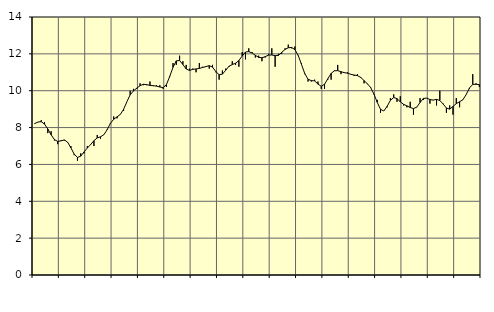
| Category | Piggar | Series 1 |
|---|---|---|
| nan | 8.2 | 8.22 |
| 87.0 | 8.3 | 8.3 |
| 87.0 | 8.4 | 8.32 |
| 87.0 | 8.3 | 8.19 |
| nan | 7.7 | 7.92 |
| 88.0 | 7.8 | 7.61 |
| 88.0 | 7.3 | 7.35 |
| 88.0 | 7.1 | 7.25 |
| nan | 7.3 | 7.28 |
| 89.0 | 7.3 | 7.33 |
| 89.0 | 7.2 | 7.21 |
| 89.0 | 7 | 6.9 |
| nan | 6.5 | 6.56 |
| 90.0 | 6.2 | 6.38 |
| 90.0 | 6.6 | 6.45 |
| 90.0 | 6.6 | 6.68 |
| nan | 7 | 6.89 |
| 91.0 | 7.1 | 7.08 |
| 91.0 | 7 | 7.29 |
| 91.0 | 7.6 | 7.44 |
| nan | 7.4 | 7.5 |
| 92.0 | 7.6 | 7.61 |
| 92.0 | 7.9 | 7.88 |
| 92.0 | 8.2 | 8.23 |
| nan | 8.6 | 8.45 |
| 93.0 | 8.5 | 8.58 |
| 93.0 | 8.7 | 8.71 |
| 93.0 | 8.9 | 8.99 |
| nan | 9.4 | 9.4 |
| 94.0 | 10 | 9.78 |
| 94.0 | 10.1 | 9.99 |
| 94.0 | 10.1 | 10.14 |
| nan | 10.4 | 10.27 |
| 95.0 | 10.3 | 10.35 |
| 95.0 | 10.3 | 10.33 |
| 95.0 | 10.5 | 10.29 |
| nan | 10.3 | 10.27 |
| 96.0 | 10.3 | 10.25 |
| 96.0 | 10.3 | 10.2 |
| 96.0 | 10.1 | 10.17 |
| nan | 10.2 | 10.33 |
| 97.0 | 10.8 | 10.77 |
| 97.0 | 11.5 | 11.27 |
| 97.0 | 11.4 | 11.62 |
| nan | 11.9 | 11.64 |
| 98.0 | 11.6 | 11.42 |
| 98.0 | 11.4 | 11.18 |
| 98.0 | 11.2 | 11.1 |
| nan | 11.2 | 11.16 |
| 99.0 | 11 | 11.18 |
| 99.0 | 11.5 | 11.21 |
| 99.0 | 11.3 | 11.26 |
| nan | 11.3 | 11.31 |
| 0.0 | 11.2 | 11.36 |
| 0.0 | 11.4 | 11.28 |
| 0.0 | 11 | 11.04 |
| nan | 10.6 | 10.87 |
| 1.0 | 11.1 | 10.9 |
| 1.0 | 11.2 | 11.11 |
| 1.0 | 11.3 | 11.33 |
| nan | 11.6 | 11.42 |
| 2.0 | 11.4 | 11.49 |
| 2.0 | 11.3 | 11.64 |
| 2.0 | 12.1 | 11.88 |
| nan | 11.7 | 12.1 |
| 3.0 | 12.3 | 12.12 |
| 3.0 | 12.1 | 12.05 |
| 3.0 | 11.8 | 11.92 |
| nan | 11.9 | 11.81 |
| 4.0 | 11.6 | 11.79 |
| 4.0 | 11.8 | 11.85 |
| 4.0 | 12 | 11.93 |
| nan | 12.3 | 11.94 |
| 5.0 | 11.3 | 11.9 |
| 5.0 | 12 | 11.92 |
| 5.0 | 12 | 12.08 |
| nan | 12.3 | 12.24 |
| 6.0 | 12.5 | 12.33 |
| 6.0 | 12.3 | 12.35 |
| 6.0 | 12.4 | 12.23 |
| nan | 11.9 | 11.92 |
| 7.0 | 11.5 | 11.43 |
| 7.0 | 10.9 | 10.93 |
| 7.0 | 10.5 | 10.62 |
| nan | 10.5 | 10.55 |
| 8.0 | 10.6 | 10.53 |
| 8.0 | 10.5 | 10.36 |
| 8.0 | 10.1 | 10.24 |
| nan | 10.1 | 10.35 |
| 9.0 | 10.6 | 10.65 |
| 9.0 | 10.6 | 10.94 |
| 9.0 | 11.1 | 11.08 |
| nan | 11.4 | 11.09 |
| 10.0 | 10.9 | 11.03 |
| 10.0 | 11 | 10.98 |
| 10.0 | 11 | 10.95 |
| nan | 10.9 | 10.89 |
| 11.0 | 10.8 | 10.85 |
| 11.0 | 10.9 | 10.82 |
| 11.0 | 10.7 | 10.72 |
| nan | 10.4 | 10.55 |
| 12.0 | 10.4 | 10.38 |
| 12.0 | 10.2 | 10.17 |
| 12.0 | 9.8 | 9.82 |
| nan | 9.5 | 9.37 |
| 13.0 | 8.8 | 8.99 |
| 13.0 | 8.9 | 8.9 |
| 13.0 | 9.1 | 9.15 |
| nan | 9.6 | 9.48 |
| 14.0 | 9.8 | 9.63 |
| 14.0 | 9.4 | 9.57 |
| 14.0 | 9.7 | 9.4 |
| nan | 9.2 | 9.26 |
| 15.0 | 9.1 | 9.18 |
| 15.0 | 9.4 | 9.09 |
| 15.0 | 8.7 | 9.03 |
| nan | 9.1 | 9.11 |
| 16.0 | 9.6 | 9.36 |
| 16.0 | 9.5 | 9.58 |
| 16.0 | 9.6 | 9.6 |
| nan | 9.3 | 9.52 |
| 17.0 | 9.5 | 9.49 |
| 17.0 | 9.2 | 9.53 |
| 17.0 | 10 | 9.47 |
| nan | 9.3 | 9.28 |
| 18.0 | 8.8 | 9.06 |
| 18.0 | 9.2 | 9 |
| 18.0 | 8.7 | 9.15 |
| nan | 9.6 | 9.3 |
| 19.0 | 9.1 | 9.4 |
| 19.0 | 9.5 | 9.51 |
| 19.0 | 9.8 | 9.79 |
| nan | 10.1 | 10.15 |
| 20.0 | 10.9 | 10.34 |
| 20.0 | 10.4 | 10.35 |
| 20.0 | 10.2 | 10.33 |